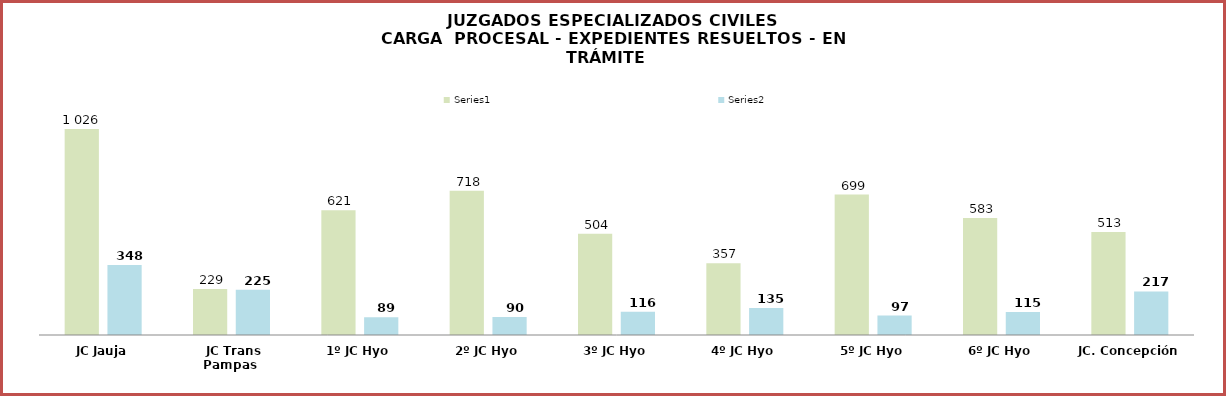
| Category | Series 0 | Series 1 |
|---|---|---|
| JC Jauja | 1026 | 348 |
| JC Trans Pampas | 229 | 225 |
| 1º JC Hyo | 621 | 89 |
| 2º JC Hyo | 718 | 90 |
| 3º JC Hyo | 504 | 116 |
| 4º JC Hyo | 357 | 135 |
| 5º JC Hyo | 699 | 97 |
| 6º JC Hyo | 583 | 115 |
| JC. Concepción | 513 | 217 |